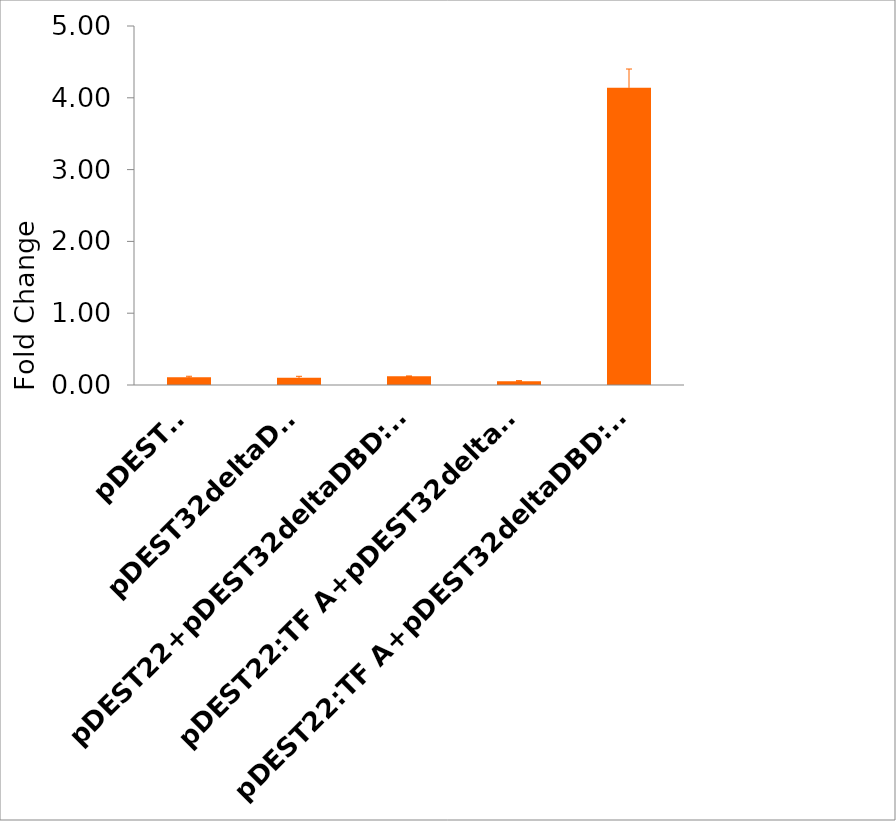
| Category | Series 0 |
|---|---|
| pDEST22 | 0.107 |
| pDEST32deltaDBD | 0.101 |
| pDEST22+pDEST32deltaDBD:TF B | 0.123 |
| pDEST22:TF A+pDEST32deltaDBD | 0.053 |
| pDEST22:TF A+pDEST32deltaDBD:TB B | 4.142 |